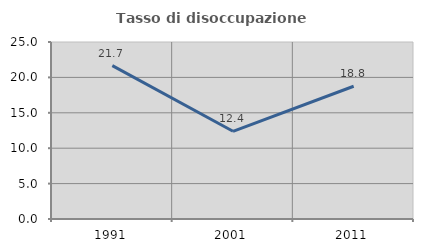
| Category | Tasso di disoccupazione giovanile  |
|---|---|
| 1991.0 | 21.659 |
| 2001.0 | 12.389 |
| 2011.0 | 18.75 |